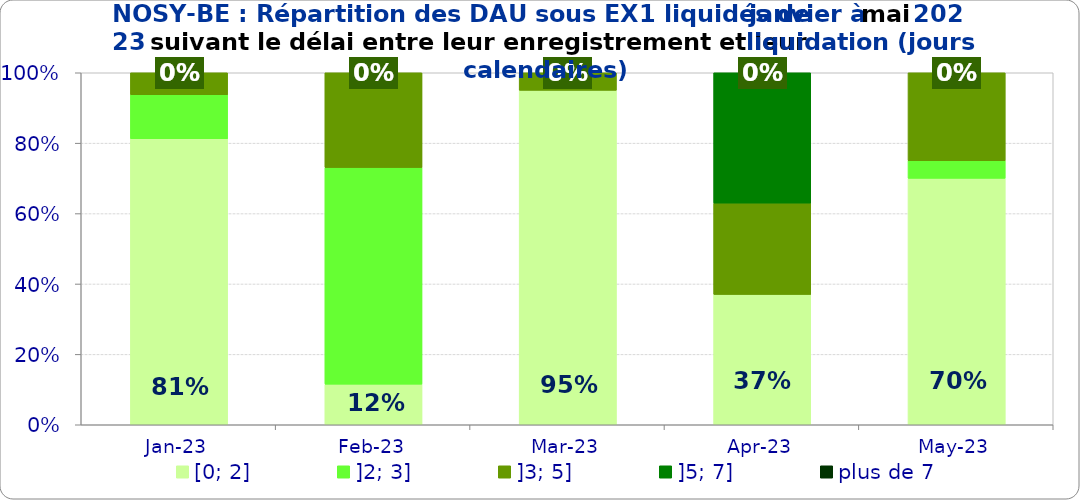
| Category | [0; 2] | ]2; 3] | ]3; 5] | ]5; 7] | plus de 7 |
|---|---|---|---|---|---|
| 2023-01-01 | 0.812 | 0.125 | 0.062 | 0 | 0 |
| 2023-02-01 | 0.115 | 0.615 | 0.269 | 0 | 0 |
| 2023-03-01 | 0.95 | 0 | 0.05 | 0 | 0 |
| 2023-04-01 | 0.37 | 0 | 0.259 | 0.37 | 0 |
| 2023-05-01 | 0.7 | 0.05 | 0.25 | 0 | 0 |